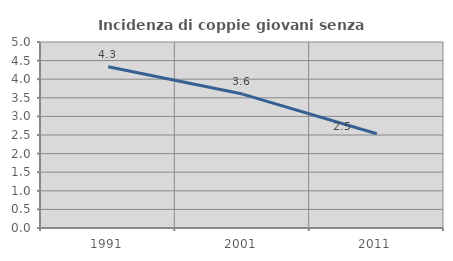
| Category | Incidenza di coppie giovani senza figli |
|---|---|
| 1991.0 | 4.335 |
| 2001.0 | 3.6 |
| 2011.0 | 2.532 |